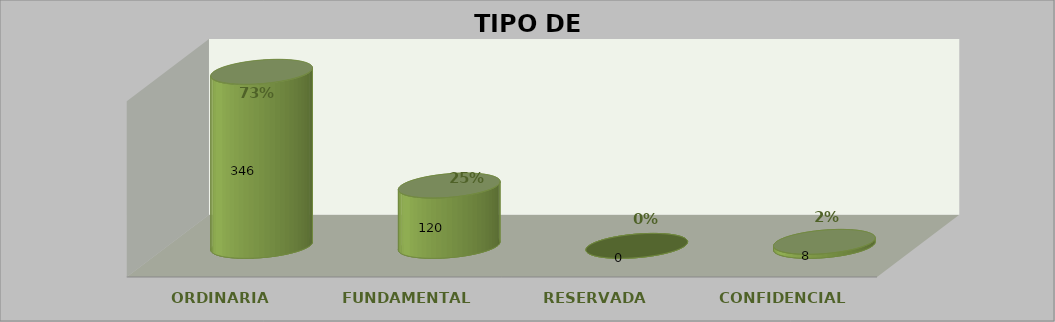
| Category | Series 3 | Series 0 | Series 1 | Series 2 |
|---|---|---|---|---|
| ORDINARIA |  |  | 346 | 0.73 |
| FUNDAMENTAL |  |  | 120 | 0.253 |
| RESERVADA |  |  | 0 | 0 |
| CONFIDENCIAL |  |  | 8 | 0.017 |